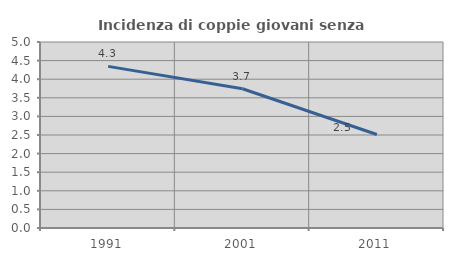
| Category | Incidenza di coppie giovani senza figli |
|---|---|
| 1991.0 | 4.345 |
| 2001.0 | 3.743 |
| 2011.0 | 2.513 |